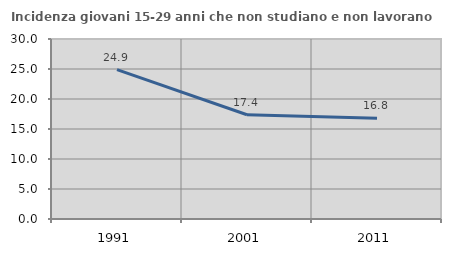
| Category | Incidenza giovani 15-29 anni che non studiano e non lavorano  |
|---|---|
| 1991.0 | 24.891 |
| 2001.0 | 17.376 |
| 2011.0 | 16.773 |